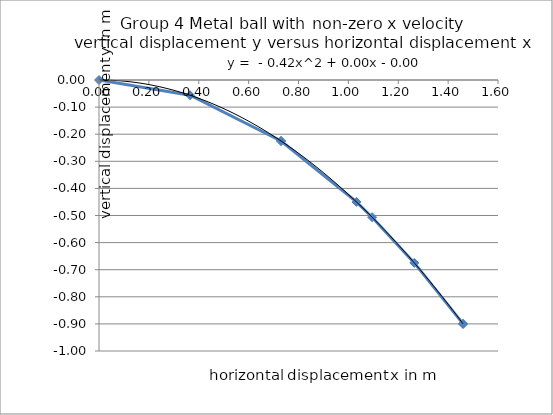
| Category | Series 0 |
|---|---|
| 0.0 | 0 |
| 0.365 | -0.056 |
| 0.73 | -0.225 |
| 0.73 | -0.225 |
| 1.0323759005323594 | -0.45 |
| 1.095 | -0.506 |
| 1.2643970895252803 | -0.675 |
| 1.46 | -0.9 |
| 1.46 | -0.9 |